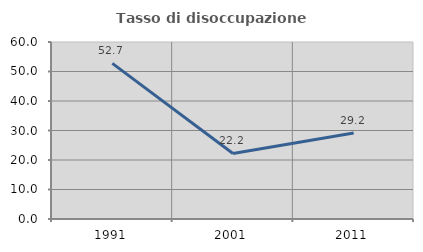
| Category | Tasso di disoccupazione giovanile  |
|---|---|
| 1991.0 | 52.74 |
| 2001.0 | 22.222 |
| 2011.0 | 29.167 |